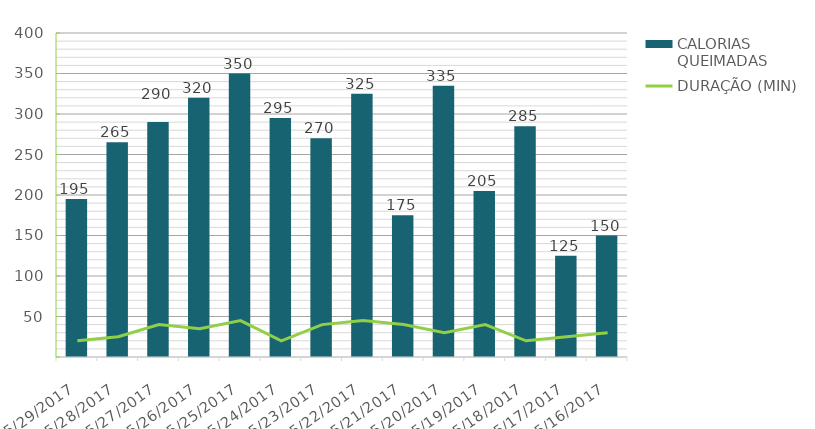
| Category | CALORIAS QUEIMADAS |
|---|---|
| 5/29/17 | 195 |
| 5/28/17 | 265 |
| 5/27/17 | 290 |
| 5/26/17 | 320 |
| 5/25/17 | 350 |
| 5/24/17 | 295 |
| 5/23/17 | 270 |
| 5/22/17 | 325 |
| 5/21/17 | 175 |
| 5/20/17 | 335 |
| 5/19/17 | 205 |
| 5/18/17 | 285 |
| 5/17/17 | 125 |
| 5/16/17 | 150 |